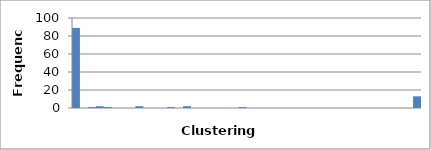
| Category | 89 |
|---|---|
| 0.0 | 89 |
| 0.023255813953488372 | 0 |
| 0.046511627906976744 | 1 |
| 0.06976744186046512 | 2 |
| 0.09302325581395349 | 1 |
| 0.11627906976744186 | 0 |
| 0.13953488372093023 | 0 |
| 0.16279069767441862 | 0 |
| 0.18604651162790697 | 2 |
| 0.20930232558139533 | 0 |
| 0.2325581395348837 | 0 |
| 0.25581395348837205 | 0 |
| 0.2790697674418604 | 1 |
| 0.30232558139534876 | 0 |
| 0.3255813953488371 | 2 |
| 0.3488372093023255 | 0 |
| 0.37209302325581384 | 0 |
| 0.3953488372093022 | 0 |
| 0.41860465116279055 | 0 |
| 0.4418604651162789 | 0 |
| 0.46511627906976727 | 0 |
| 0.4883720930232556 | 1 |
| 0.511627906976744 | 0 |
| 0.5348837209302324 | 0 |
| 0.5581395348837208 | 0 |
| 0.5813953488372092 | 0 |
| 0.6046511627906976 | 0 |
| 0.627906976744186 | 0 |
| 0.6511627906976745 | 0 |
| 0.6744186046511629 | 0 |
| 0.6976744186046513 | 0 |
| 0.7209302325581397 | 0 |
| 0.7441860465116281 | 0 |
| 0.7674418604651165 | 0 |
| 0.790697674418605 | 0 |
| 0.8139534883720934 | 0 |
| 0.8372093023255818 | 0 |
| 0.8604651162790702 | 0 |
| 0.8837209302325586 | 0 |
| 0.906976744186047 | 0 |
| 0.9302325581395354 | 0 |
| 0.9534883720930238 | 0 |
| 0.9767441860465123 | 0 |
| 1.0 | 13 |